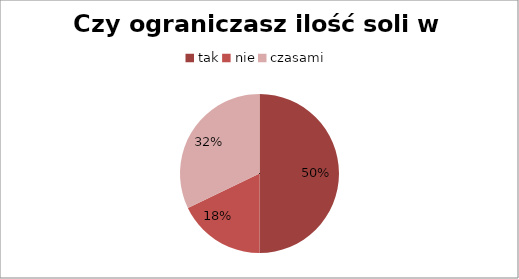
| Category | Czy ograniczasz ilość soli w potrawach? |
|---|---|
| tak | 14 |
| nie | 5 |
| czasami | 9 |